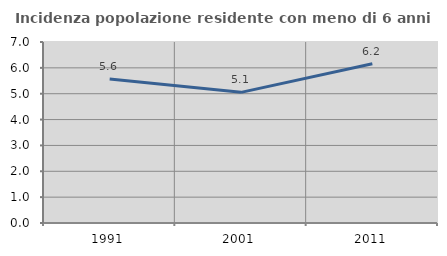
| Category | Incidenza popolazione residente con meno di 6 anni |
|---|---|
| 1991.0 | 5.568 |
| 2001.0 | 5.053 |
| 2011.0 | 6.158 |